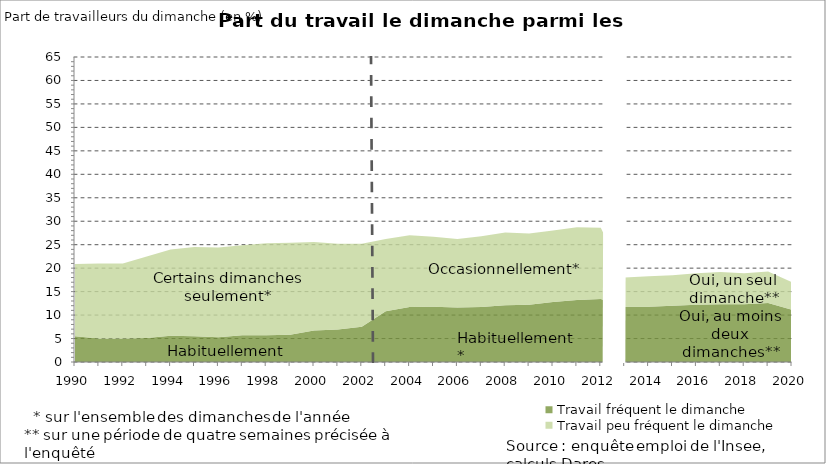
| Category | Travail fréquent le dimanche | Travail peu fréquent le dimanche |
|---|---|---|
| 1990.0 | 5.5 | 15.4 |
| 1991.0 | 5 | 16 |
| 1992.0 | 5 | 16 |
| 1993.0 | 5.1 | 17.4 |
| 1994.0 | 5.6 | 18.4 |
| 1995.0 | 5.5 | 19 |
| 1996.0 | 5.3 | 19.1 |
| 1997.0 | 5.7 | 19.2 |
| 1998.0 | 5.7 | 19.6 |
| 1999.0 | 5.8 | 19.6 |
| 2000.0 | 6.7 | 18.9 |
| 2001.0 | 6.9 | 18.3 |
| 2002.0 | 7.5 | 17.7 |
| 2003.0 | 10.8 | 15.4 |
| 2004.0 | 11.7 | 15.3 |
| 2005.0 | 11.8 | 14.9 |
| 2006.0 | 11.6 | 14.6 |
| 2007.0 | 11.7 | 15.1 |
| 2008.0 | 12.1 | 15.5 |
| 2009.0 | 12.2 | 15.2 |
| 2010.0 | 12.8 | 15.2 |
| 2011.0 | 13.2 | 15.5 |
| 2012.0 | 13.4 | 15.2 |
| 2013.0 | 11.8 | 6.2 |
| 2014.0 | 11.8 | 6.5 |
| 2015.0 | 12 | 6.5 |
| 2016.0 | 12.2 | 6.7 |
| 2017.0 | 12.3 | 6.9 |
| 2018.0 | 12.3 | 6.6 |
| 2019.0 | 12.6 | 6.7 |
| 2020.0 | 11.1 | 5.9 |